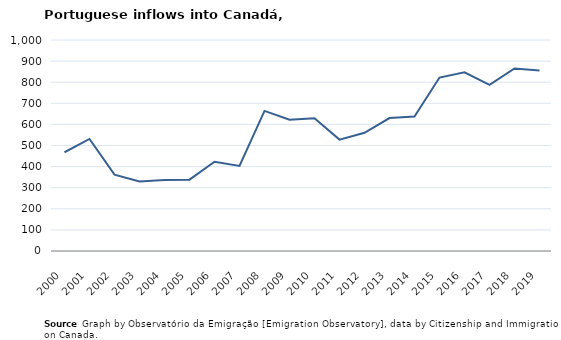
| Category | Entradas |
|---|---|
| 2000.0 | 468 |
| 2001.0 | 531 |
| 2002.0 | 362 |
| 2003.0 | 329 |
| 2004.0 | 336 |
| 2005.0 | 338 |
| 2006.0 | 423 |
| 2007.0 | 403 |
| 2008.0 | 664 |
| 2009.0 | 622 |
| 2010.0 | 629 |
| 2011.0 | 528 |
| 2012.0 | 560 |
| 2013.0 | 630 |
| 2014.0 | 637 |
| 2015.0 | 822 |
| 2016.0 | 847 |
| 2017.0 | 787 |
| 2018.0 | 865 |
| 2019.0 | 855 |